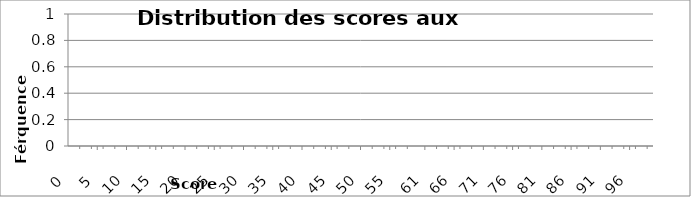
| Category | Series 0 |
|---|---|
| 0.0 | 0 |
| 1.0 | 0 |
| 2.0 | 0 |
| 3.0 | 0 |
| 4.0 | 0 |
| 5.0 | 0 |
| 6.0 | 0 |
| 7.0 | 0 |
| 8.0 | 0 |
| 9.0 | 0 |
| 10.0 | 0 |
| 11.0 | 0 |
| 12.0 | 0 |
| 13.0 | 0 |
| 14.0 | 0 |
| 15.0 | 0 |
| 16.0 | 0 |
| 17.0 | 0 |
| 18.0 | 0 |
| 19.0 | 0 |
| 20.0 | 0 |
| 21.0 | 0 |
| 22.0 | 0 |
| 23.0 | 0 |
| 24.0 | 0 |
| 25.0 | 0 |
| 26.0 | 0 |
| 27.0 | 0 |
| 28.0 | 0 |
| 29.0 | 0 |
| 30.0 | 0 |
| 31.0 | 0 |
| 32.0 | 0 |
| 33.0 | 0 |
| 34.0 | 0 |
| 35.0 | 0 |
| 36.0 | 0 |
| 37.0 | 0 |
| 38.0 | 0 |
| 39.0 | 0 |
| 40.0 | 0 |
| 41.0 | 0 |
| 42.0 | 0 |
| 43.0 | 0 |
| 44.0 | 0 |
| 45.0 | 0 |
| 46.0 | 0 |
| 47.0 | 0 |
| 48.0 | 0 |
| 49.0 | 0 |
| 50.0 | 0 |
| 51.0 | 0 |
| 52.0 | 0 |
| 53.0 | 0 |
| 54.0 | 0 |
| 55.0 | 0 |
| 56.0 | 0 |
| 57.0 | 0 |
| 58.0 | 0 |
| 59.0 | 0 |
| 60.0 | 0 |
| 61.0 | 0 |
| 62.0 | 0 |
| 63.0 | 0 |
| 64.0 | 0 |
| 65.0 | 0 |
| 66.0 | 0 |
| 67.0 | 0 |
| 68.0 | 0 |
| 69.0 | 0 |
| 70.0 | 0 |
| 71.0 | 0 |
| 72.0 | 0 |
| 73.0 | 0 |
| 74.0 | 0 |
| 75.0 | 0 |
| 76.0 | 0 |
| 77.0 | 0 |
| 78.0 | 0 |
| 79.0 | 0 |
| 80.0 | 0 |
| 81.0 | 0 |
| 82.0 | 0 |
| 83.0 | 0 |
| 84.0 | 0 |
| 85.0 | 0 |
| 86.0 | 0 |
| 87.0 | 0 |
| 88.0 | 0 |
| 89.0 | 0 |
| 90.0 | 0 |
| 91.0 | 0 |
| 92.0 | 0 |
| 93.0 | 0 |
| 94.0 | 0 |
| 95.0 | 0 |
| 96.0 | 0 |
| 97.0 | 0 |
| 98.0 | 0 |
| 99.0 | 0 |
| 100.0 | 0 |